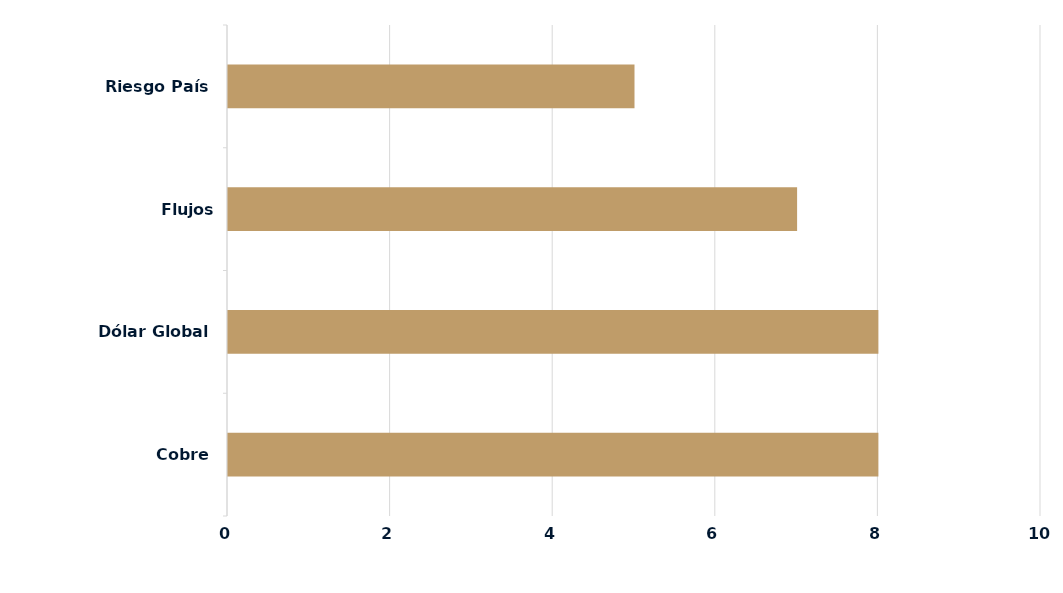
| Category | Series 0 |
|---|---|
| Cobre | 8 |
| Dólar Global | 8 |
| Flujos Locales/Extranjeros | 7 |
| Riesgo País | 5 |